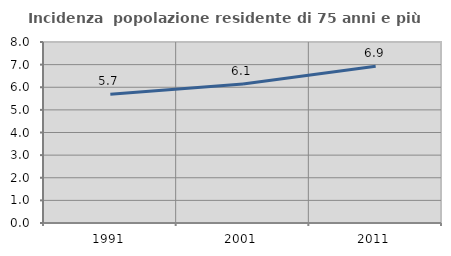
| Category | Incidenza  popolazione residente di 75 anni e più |
|---|---|
| 1991.0 | 5.695 |
| 2001.0 | 6.144 |
| 2011.0 | 6.924 |